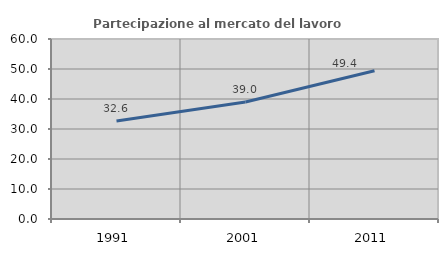
| Category | Partecipazione al mercato del lavoro  femminile |
|---|---|
| 1991.0 | 32.632 |
| 2001.0 | 38.981 |
| 2011.0 | 49.402 |